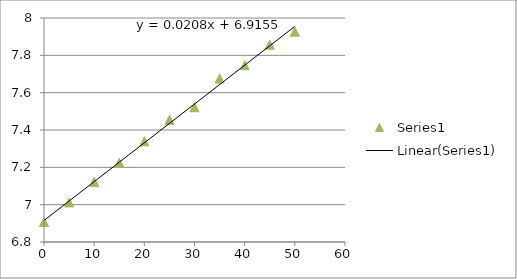
| Category | Series 2 |
|---|---|
| 0.0 | 6.908 |
| 5.0 | 7.012 |
| 10.0 | 7.122 |
| 15.0 | 7.224 |
| 20.0 | 7.34 |
| 25.0 | 7.454 |
| 30.0 | 7.522 |
| 35.0 | 7.676 |
| 40.0 | 7.747 |
| 45.0 | 7.857 |
| 50.0 | 7.927 |